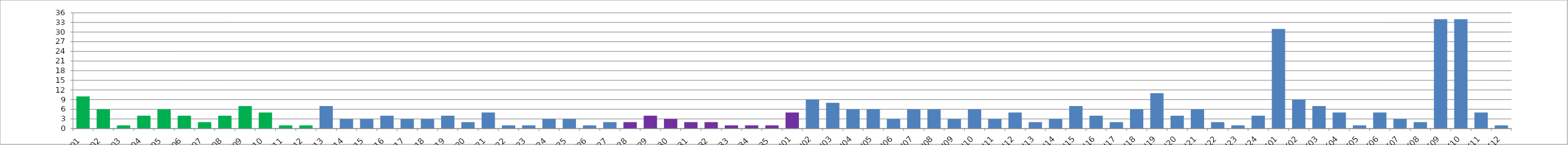
| Category | Series 0 |
|---|---|
| W01 | 10 |
| W02 | 6 |
| W03 | 1 |
| W04 | 4 |
| W05 | 6 |
| W06 | 4 |
| W07 | 2 |
| W08 | 4 |
| W09 | 7 |
| W10 | 5 |
| W11 | 1 |
| W12 | 1 |
| W13 | 7 |
| W14 | 3 |
| W15 | 3 |
| W16 | 4 |
| W17 | 3 |
| W18 | 3 |
| W19 | 4 |
| W20 | 2 |
| W21 | 5 |
| W22 | 1 |
| W23 | 1 |
| W24 | 3 |
| W25 | 3 |
| W26 | 1 |
| W27 | 2 |
| W28 | 2 |
| W29 | 4 |
| W30 | 3 |
| W31 | 2 |
| W32 | 2 |
| W33 | 1 |
| W34 | 1 |
| W35 | 1 |
| U01 | 5 |
| U02 | 9 |
| U03 | 8 |
| U04 | 6 |
| U05 | 6 |
| U06 | 3 |
| U07 | 6 |
| U08 | 6 |
| U09 | 3 |
| U10 | 6 |
| U11 | 3 |
| U12 | 5 |
| U13 | 2 |
| U14 | 3 |
| U15 | 7 |
| U16 | 4 |
| U17 | 2 |
| U18 | 6 |
| U19 | 11 |
| U20 | 4 |
| U21 | 6 |
| U22 | 2 |
| U23 | 1 |
| U24 | 4 |
| K01 | 31 |
| K02 | 9 |
| K03 | 7 |
| K04 | 5 |
| K05 | 1 |
| K06 | 5 |
| K07 | 3 |
| K08 | 2 |
| K09 | 34 |
| K10 | 34 |
| K11 | 5 |
| K12 | 1 |